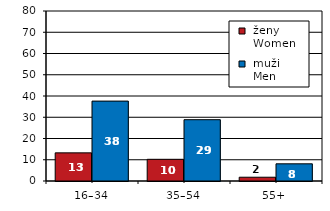
| Category |  ženy 
 Women |  muži 
 Men |
|---|---|---|
| 16–34 | 13.236 | 37.597 |
| 35–54 | 10.208 | 28.85 |
| 55+  | 1.775 | 8.082 |